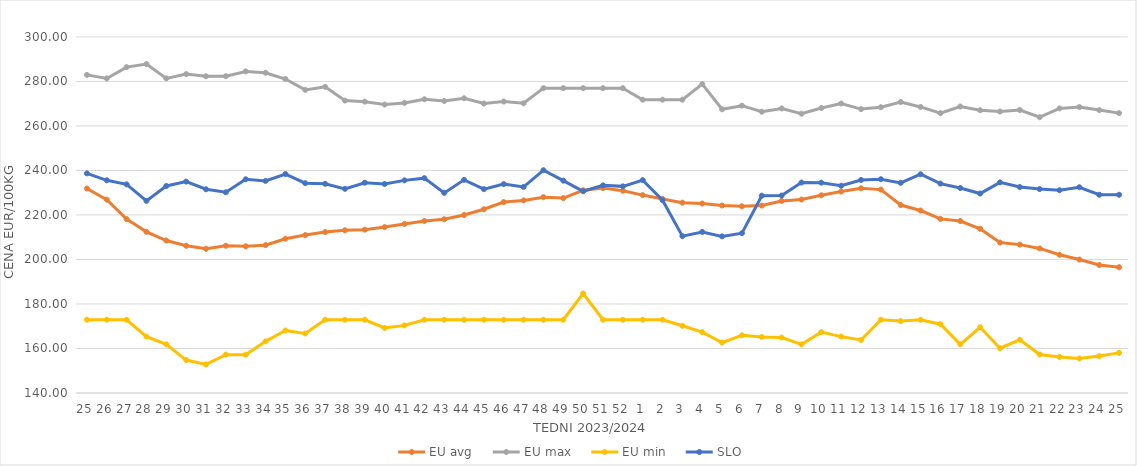
| Category | EU avg | EU max | EU min | SLO |
|---|---|---|---|---|
| 25.0 | 231.895 | 282.95 | 172.91 | 238.69 |
| 26.0 | 226.903 | 281.34 | 172.91 | 235.57 |
| 27.0 | 218.126 | 286.43 | 172.91 | 233.75 |
| 28.0 | 212.406 | 287.8 | 165.32 | 226.35 |
| 29.0 | 208.504 | 281.37 | 161.87 | 233.03 |
| 30.0 | 206.149 | 283.3 | 154.8 | 235 |
| 31.0 | 204.79 | 282.32 | 152.83 | 231.55 |
| 32.0 | 206.16 | 282.36 | 157.23 | 230.2 |
| 33.0 | 205.917 | 284.5 | 157.23 | 236.04 |
| 34.0 | 206.436 | 283.9 | 163.21 | 235.32 |
| 35.0 | 209.326 | 281.09 | 168.085 | 238.39 |
| 36.0 | 210.957 | 276.21 | 166.745 | 234.27 |
| 37.0 | 212.325 | 277.59 | 172.91 | 234 |
| 38.0 | 213.132 | 271.4 | 172.91 | 231.74 |
| 39.0 | 213.398 | 270.91 | 172.91 | 234.5 |
| 40.0 | 214.548 | 269.62 | 169.209 | 233.92 |
| 41.0 | 215.966 | 270.36 | 170.387 | 235.54 |
| 42.0 | 217.294 | 271.99 | 172.91 | 236.54 |
| 43.0 | 218.091 | 271.22 | 172.91 | 229.92 |
| 44.0 | 219.965 | 272.45 | 172.91 | 235.77 |
| 45.0 | 222.584 | 270.09 | 172.91 | 231.6 |
| 46.0 | 225.795 | 270.99 | 172.91 | 233.89 |
| 47.0 | 226.547 | 270.18 | 172.91 | 232.62 |
| 48.0 | 227.993 | 276.99 | 172.91 | 240.11 |
| 49.0 | 227.575 | 276.99 | 172.91 | 235.41 |
| 50.0 | 231.099 | 276.99 | 184.72 | 230.65 |
| 51.0 | 232.088 | 276.99 | 172.91 | 233.3 |
| 52.0 | 230.884 | 276.99 | 172.91 | 232.85 |
| 1.0 | 228.928 | 271.8 | 172.91 | 235.66 |
| 2.0 | 227.213 | 271.8 | 172.91 | 226.65 |
| 3.0 | 225.533 | 271.8 | 170.2 | 210.5 |
| 4.0 | 225.142 | 278.81 | 167.37 | 212.37 |
| 5.0 | 224.262 | 267.49 | 162.66 | 210.38 |
| 6.0 | 223.902 | 269.11 | 165.95 | 211.82 |
| 7.0 | 224.231 | 266.38 | 165.18 | 228.66 |
| 8.0 | 226.285 | 267.85 | 164.92 | 228.73 |
| 9.0 | 226.925 | 265.51 | 161.84 | 234.57 |
| 10.0 | 228.833 | 268.09 | 167.35 | 234.52 |
| 11.0 | 230.511 | 270.07 | 165.34 | 233.13 |
| 12.0 | 231.98 | 267.57 | 163.83 | 235.73 |
| 13.0 | 231.388 | 268.42 | 172.91 | 236.07 |
| 14.0 | 224.453 | 270.75 | 172.32 | 234.43 |
| 15.0 | 222.007 | 268.54 | 172.91 | 238.3 |
| 16.0 | 218.232 | 265.74 | 170.93 | 234.08 |
| 17.0 | 217.278 | 268.73 | 161.86 | 232.11 |
| 18.0 | 213.787 | 267.06 | 169.53 | 229.63 |
| 19.0 | 207.614 | 266.47 | 160.134 | 234.63 |
| 20.0 | 206.677 | 267.16 | 163.91 | 232.54 |
| 21.0 | 204.973 | 263.92 | 157.32 | 231.64 |
| 22.0 | 202.109 | 267.89 | 156.156 | 231.11 |
| 23.0 | 199.965 | 268.49 | 155.527 | 232.45 |
| 24.0 | 197.492 | 267.12 | 156.58 | 229.09 |
| 25.0 | 196.5 | 265.76 | 158.034 | 229.07 |